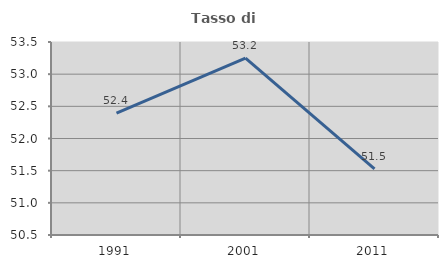
| Category | Tasso di occupazione   |
|---|---|
| 1991.0 | 52.395 |
| 2001.0 | 53.248 |
| 2011.0 | 51.529 |